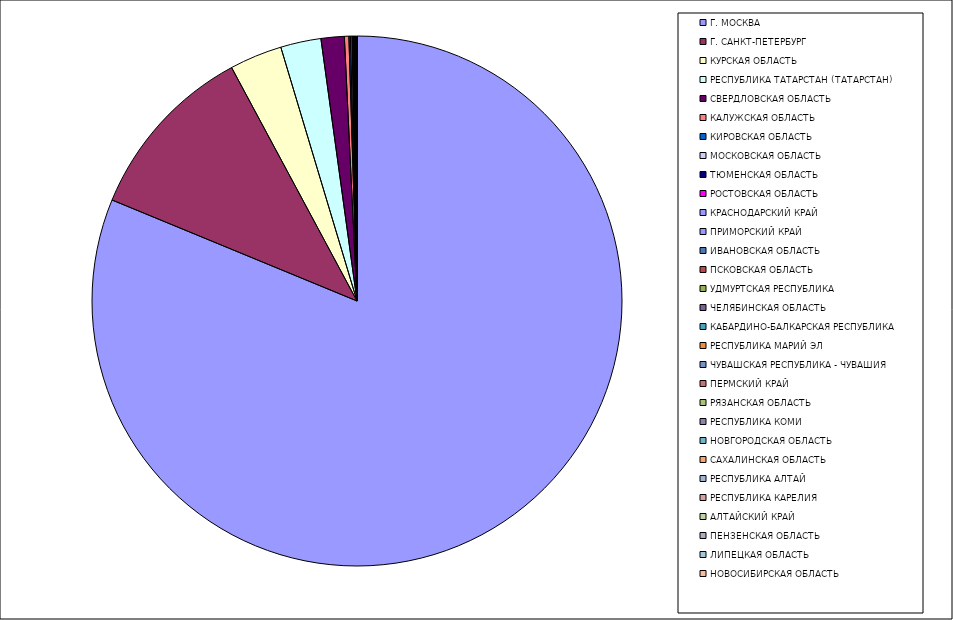
| Category | Оборот |
|---|---|
| Г. МОСКВА | 81.216 |
| Г. САНКТ-ПЕТЕРБУРГ | 10.928 |
| КУРСКАЯ ОБЛАСТЬ | 3.205 |
| РЕСПУБЛИКА ТАТАРСТАН (ТАТАРСТАН) | 2.464 |
| СВЕРДЛОВСКАЯ ОБЛАСТЬ | 1.415 |
| КАЛУЖСКАЯ ОБЛАСТЬ | 0.274 |
| КИРОВСКАЯ ОБЛАСТЬ | 0.094 |
| МОСКОВСКАЯ ОБЛАСТЬ | 0.089 |
| ТЮМЕНСКАЯ ОБЛАСТЬ | 0.053 |
| РОСТОВСКАЯ ОБЛАСТЬ | 0.051 |
| КРАСНОДАРСКИЙ КРАЙ | 0.027 |
| ПРИМОРСКИЙ КРАЙ | 0.026 |
| ИВАНОВСКАЯ ОБЛАСТЬ | 0.025 |
| ПСКОВСКАЯ ОБЛАСТЬ | 0.015 |
| УДМУРТСКАЯ РЕСПУБЛИКА | 0.015 |
| ЧЕЛЯБИНСКАЯ ОБЛАСТЬ | 0.014 |
| КАБАРДИНО-БАЛКАРСКАЯ РЕСПУБЛИКА | 0.013 |
| РЕСПУБЛИКА МАРИЙ ЭЛ | 0.013 |
| ЧУВАШСКАЯ РЕСПУБЛИКА - ЧУВАШИЯ | 0.011 |
| ПЕРМСКИЙ КРАЙ | 0.007 |
| РЯЗАНСКАЯ ОБЛАСТЬ | 0.006 |
| РЕСПУБЛИКА КОМИ | 0.004 |
| НОВГОРОДСКАЯ ОБЛАСТЬ | 0.004 |
| САХАЛИНСКАЯ ОБЛАСТЬ | 0.003 |
| РЕСПУБЛИКА АЛТАЙ | 0.003 |
| РЕСПУБЛИКА КАРЕЛИЯ | 0.003 |
| АЛТАЙСКИЙ КРАЙ | 0.003 |
| ПЕНЗЕНСКАЯ ОБЛАСТЬ | 0.003 |
| ЛИПЕЦКАЯ ОБЛАСТЬ | 0.002 |
| НОВОСИБИРСКАЯ ОБЛАСТЬ | 0.002 |